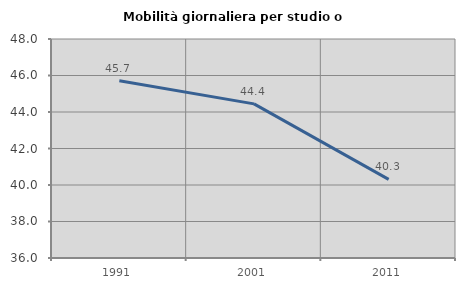
| Category | Mobilità giornaliera per studio o lavoro |
|---|---|
| 1991.0 | 45.714 |
| 2001.0 | 44.444 |
| 2011.0 | 40.31 |